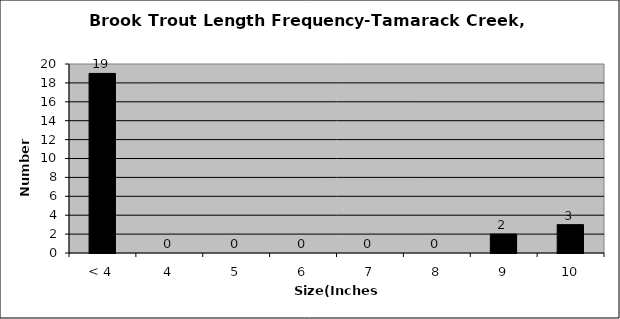
| Category | Series 0 |
|---|---|
| < 4 | 19 |
| 4 | 0 |
| 5 | 0 |
| 6 | 0 |
| 7 | 0 |
| 8 | 0 |
| 9 | 2 |
| 10 | 3 |